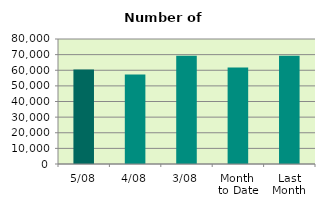
| Category | Series 0 |
|---|---|
| 5/08 | 60472 |
| 4/08 | 57346 |
| 3/08 | 69288 |
| Month 
to Date | 61715.5 |
| Last
Month | 69237.818 |